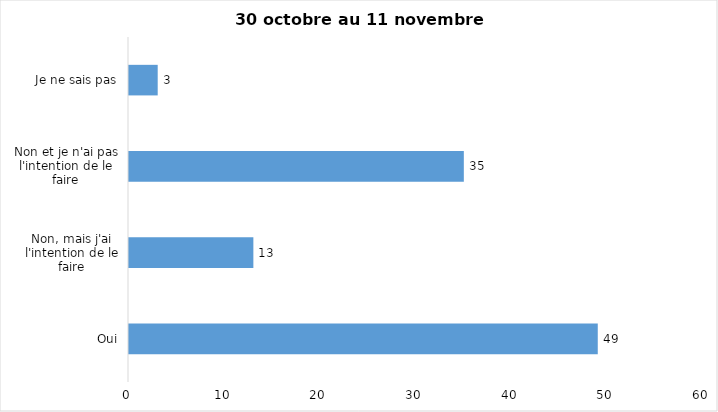
| Category | Series 0 |
|---|---|
| Oui | 49 |
| Non, mais j'ai l'intention de le faire | 13 |
| Non et je n'ai pas l'intention de le faire | 35 |
| Je ne sais pas | 3 |